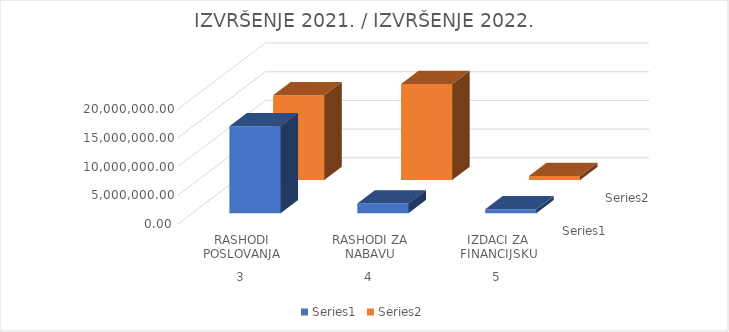
| Category | Series 0 | Series 1 |
|---|---|---|
| 0 | 15151788 | 14779323.54 |
| 1 | 1699926 | 16746477.21 |
| 2 | 669231 | 719109.41 |